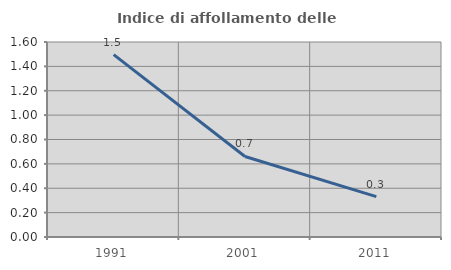
| Category | Indice di affollamento delle abitazioni  |
|---|---|
| 1991.0 | 1.497 |
| 2001.0 | 0.661 |
| 2011.0 | 0.331 |